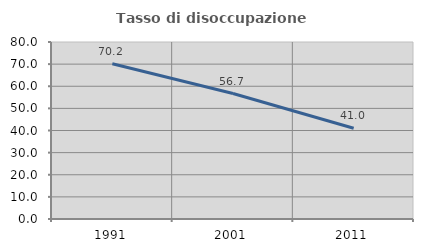
| Category | Tasso di disoccupazione giovanile  |
|---|---|
| 1991.0 | 70.191 |
| 2001.0 | 56.701 |
| 2011.0 | 41.004 |